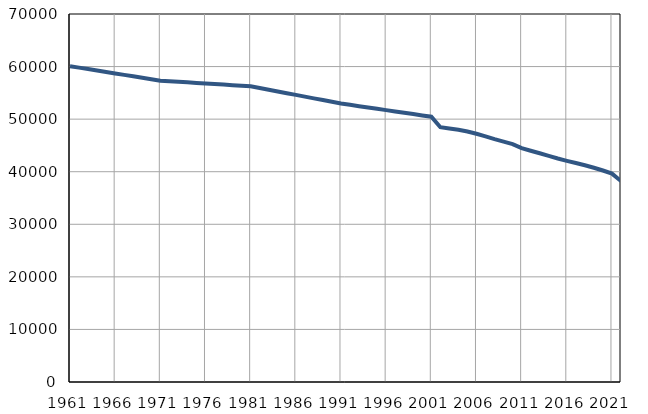
| Category | Population
size |
|---|---|
| 1961.0 | 60075 |
| 1962.0 | 59799 |
| 1963.0 | 59523 |
| 1964.0 | 59247 |
| 1965.0 | 58971 |
| 1966.0 | 58695 |
| 1967.0 | 58419 |
| 1968.0 | 58143 |
| 1969.0 | 57867 |
| 1970.0 | 57591 |
| 1971.0 | 57315 |
| 1972.0 | 57209 |
| 1973.0 | 57103 |
| 1974.0 | 56997 |
| 1975.0 | 56891 |
| 1976.0 | 56786 |
| 1977.0 | 56680 |
| 1978.0 | 56574 |
| 1979.0 | 56467 |
| 1980.0 | 56362 |
| 1981.0 | 56256 |
| 1982.0 | 55927 |
| 1983.0 | 55599 |
| 1984.0 | 55270 |
| 1985.0 | 54941 |
| 1986.0 | 54613 |
| 1987.0 | 54284 |
| 1988.0 | 53955 |
| 1989.0 | 53626 |
| 1990.0 | 53297 |
| 1991.0 | 52969 |
| 1992.0 | 52718 |
| 1993.0 | 52467 |
| 1994.0 | 52215 |
| 1995.0 | 51964 |
| 1996.0 | 51713 |
| 1997.0 | 51461 |
| 1998.0 | 51210 |
| 1999.0 | 50959 |
| 2000.0 | 50707 |
| 2001.0 | 50456 |
| 2002.0 | 48459 |
| 2003.0 | 48213 |
| 2004.0 | 47995 |
| 2005.0 | 47653 |
| 2006.0 | 47227 |
| 2007.0 | 46729 |
| 2008.0 | 46201 |
| 2009.0 | 45725 |
| 2010.0 | 45261 |
| 2011.0 | 44479 |
| 2012.0 | 43986 |
| 2013.0 | 43511 |
| 2014.0 | 43021 |
| 2015.0 | 42515 |
| 2016.0 | 42068 |
| 2017.0 | 41652 |
| 2018.0 | 41218 |
| 2019.0 | 40748 |
| 2020.0 | 40229 |
| 2021.0 | 39643 |
| 2022.0 | 38224 |